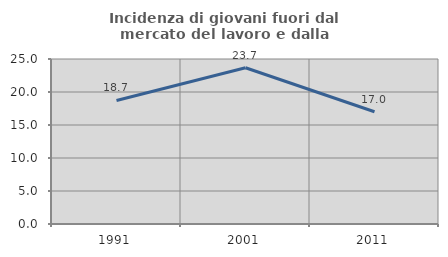
| Category | Incidenza di giovani fuori dal mercato del lavoro e dalla formazione  |
|---|---|
| 1991.0 | 18.714 |
| 2001.0 | 23.679 |
| 2011.0 | 17.001 |